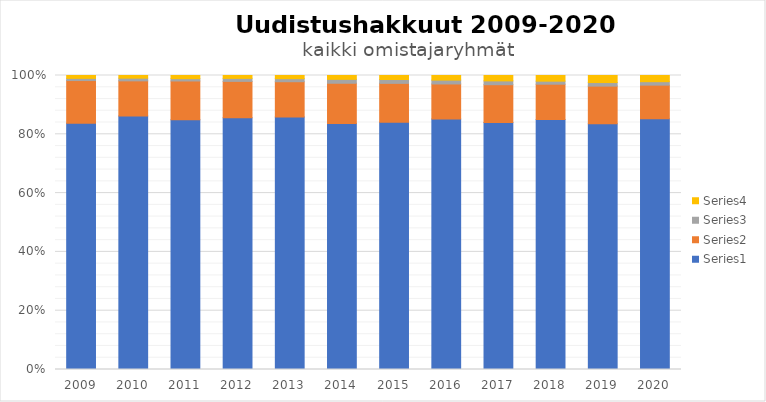
| Category | Series 0 | Series 1 | Series 2 | Series 3 |
|---|---|---|---|---|
| 2009.0 | 87934.036 | 15192.464 | 784.71 | 1022.13 |
| 2010.0 | 142631.461 | 19836.749 | 1513.17 | 1505.11 |
| 2011.0 | 105253.164 | 16381.296 | 978.42 | 1327.88 |
| 2012.0 | 117788.025 | 17066.615 | 1403.15 | 1349.6 |
| 2013.0 | 140532.767 | 19653.423 | 1698.31 | 1763.46 |
| 2014.0 | 145229.478 | 23833.352 | 2310 | 2268.77 |
| 2015.0 | 127928.716 | 20052.824 | 2004.54 | 2063.19 |
| 2016.0 | 138125.756 | 19315.984 | 2132.05 | 2538.14 |
| 2017.0 | 141705.65 | 21614.23 | 2191.19 | 3091.09 |
| 2018.0 | 161934.029 | 22783.407 | 1960.09 | 3666.01 |
| 2019.0 | 113270.633 | 17411.295 | 1647.84 | 3247.54 |
| 2020.0 | 129544.029 | 17436.131 | 1787.72 | 3192.34 |